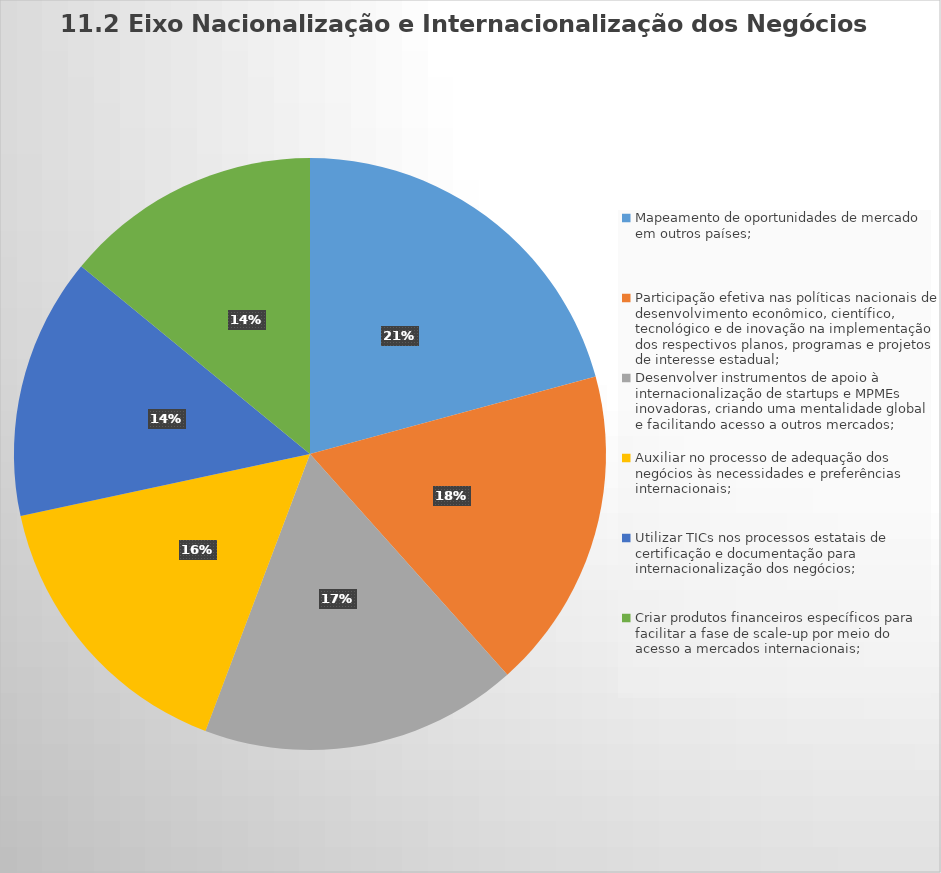
| Category | Series 0 |
|---|---|
| Mapeamento de oportunidades de mercado em outros países;‬ | 170 |
| Participação efetiva nas políticas nacionais de desenvolvimento econômico, científico, tecnológico e de inovação na implementação dos respectivos planos, programas e projetos de interesse estadual; | 144 |
| Desenvolver instrumentos de apoio à internacionalização de startups e MPMEs inovadoras, criando uma mentalidade global e facilitando acesso a outros mercados; | 142 |
| Auxiliar no processo de adequação dos negócios às necessidades e preferências internacionais; | 130 |
| Utilizar‬‭ TICs‬‭ nos‬‭ processos‬‭ estatais‬‭ de‬‭ certificação‬‭ e‬‭ documentação‬‭ para‬‭ internacionalização‬‭ dos‬ negócios;‬ | 117 |
| Criar‬ ‭produtos‬ ‭financeiros‬ ‭específicos‬ ‭para‬ ‭facilitar‬ ‭a‬ ‭fase‬ ‭de‬ ‭scale-up‬ ‭por‬ ‭meio‬ ‭do‬ ‭acesso‬ ‭a‬ mercados internacionais;‬ | 115 |